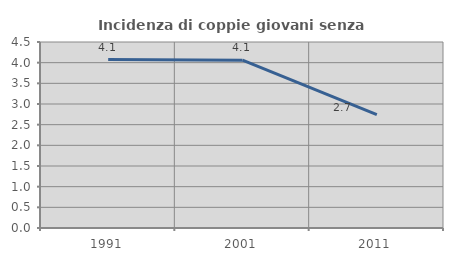
| Category | Incidenza di coppie giovani senza figli |
|---|---|
| 1991.0 | 4.075 |
| 2001.0 | 4.06 |
| 2011.0 | 2.742 |